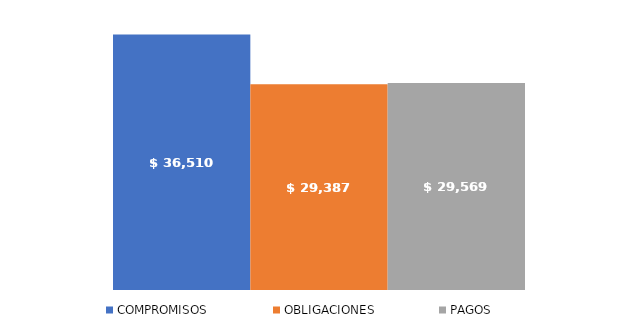
| Category | COMPROMISOS | OBLIGACIONES | PAGOS |
|---|---|---|---|
| Total | 36509826963.328 | 29386555888.338 | 29569452022.263 |